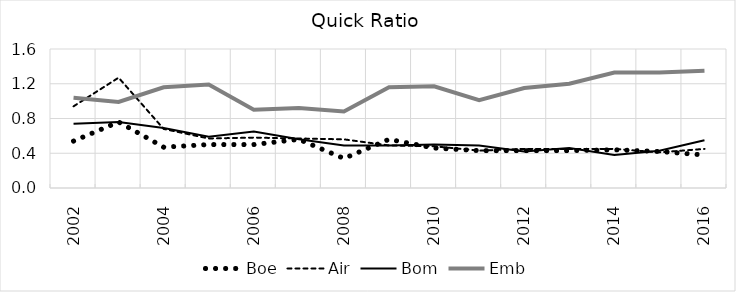
| Category | Boe | Air | Bom | Emb |
|---|---|---|---|---|
| 2002.0 | 0.54 | 0.94 | 0.74 | 1.04 |
| 2003.0 | 0.76 | 1.27 | 0.76 | 0.99 |
| 2004.0 | 0.47 | 0.68 | 0.69 | 1.16 |
| 2005.0 | 0.5 | 0.57 | 0.59 | 1.19 |
| 2006.0 | 0.5 | 0.58 | 0.65 | 0.9 |
| 2007.0 | 0.56 | 0.57 | 0.56 | 0.92 |
| 2008.0 | 0.34 | 0.56 | 0.49 | 0.88 |
| 2009.0 | 0.56 | 0.49 | 0.49 | 1.16 |
| 2010.0 | 0.46 | 0.48 | 0.5 | 1.17 |
| 2011.0 | 0.43 | 0.43 | 0.49 | 1.01 |
| 2012.0 | 0.43 | 0.45 | 0.42 | 1.15 |
| 2013.0 | 0.43 | 0.45 | 0.46 | 1.2 |
| 2014.0 | 0.44 | 0.45 | 0.38 | 1.33 |
| 2015.0 | 0.42 | 0.41 | 0.43 | 1.33 |
| 2016.0 | 0.38 | 0.45 | 0.55 | 1.35 |